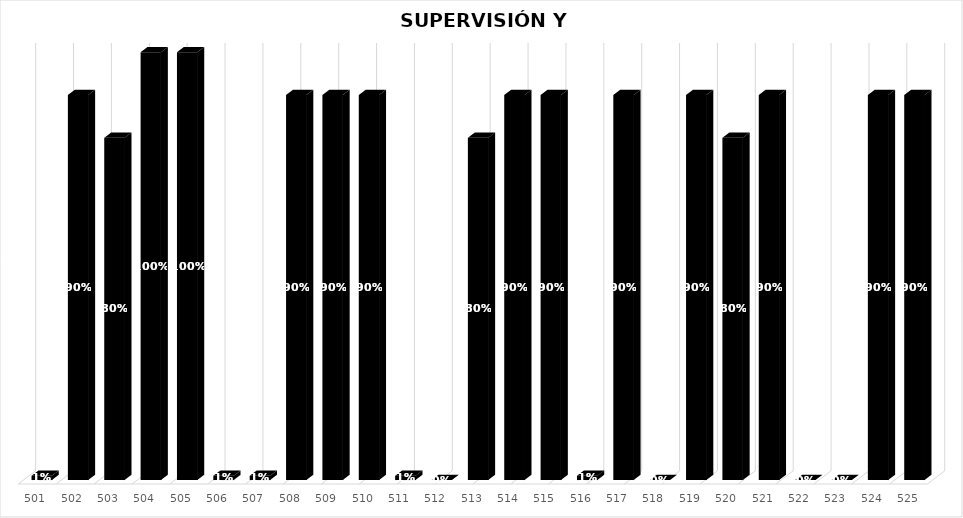
| Category | % Avance |
|---|---|
| 501.0 | 0.01 |
| 502.0 | 0.9 |
| 503.0 | 0.8 |
| 504.0 | 1 |
| 505.0 | 1 |
| 506.0 | 0.01 |
| 507.0 | 0.01 |
| 508.0 | 0.9 |
| 509.0 | 0.9 |
| 510.0 | 0.9 |
| 511.0 | 0.01 |
| 512.0 | 0 |
| 513.0 | 0.8 |
| 514.0 | 0.9 |
| 515.0 | 0.9 |
| 516.0 | 0.01 |
| 517.0 | 0.9 |
| 518.0 | 0 |
| 519.0 | 0.9 |
| 520.0 | 0.8 |
| 521.0 | 0.9 |
| 522.0 | 0 |
| 523.0 | 0 |
| 524.0 | 0.9 |
| 525.0 | 0.9 |